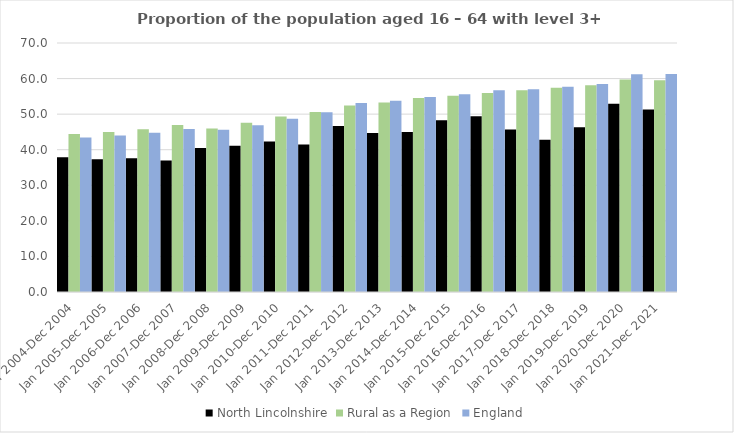
| Category | North Lincolnshire | Rural as a Region | England |
|---|---|---|---|
| Jan 2004-Dec 2004 | 37.9 | 44.405 | 43.4 |
| Jan 2005-Dec 2005 | 37.3 | 44.973 | 44 |
| Jan 2006-Dec 2006 | 37.6 | 45.774 | 44.8 |
| Jan 2007-Dec 2007 | 37 | 46.968 | 45.8 |
| Jan 2008-Dec 2008 | 40.5 | 45.964 | 45.6 |
| Jan 2009-Dec 2009 | 41.1 | 47.59 | 46.9 |
| Jan 2010-Dec 2010 | 42.3 | 49.362 | 48.7 |
| Jan 2011-Dec 2011 | 41.5 | 50.602 | 50.5 |
| Jan 2012-Dec 2012 | 46.7 | 52.439 | 53.1 |
| Jan 2013-Dec 2013 | 44.7 | 53.276 | 53.8 |
| Jan 2014-Dec 2014 | 45 | 54.57 | 54.8 |
| Jan 2015-Dec 2015 | 48.3 | 55.16 | 55.6 |
| Jan 2016-Dec 2016 | 49.4 | 55.941 | 56.7 |
| Jan 2017-Dec 2017 | 45.7 | 56.689 | 57 |
| Jan 2018-Dec 2018 | 42.8 | 57.389 | 57.7 |
| Jan 2019-Dec 2019 | 46.3 | 58.147 | 58.5 |
| Jan 2020-Dec 2020 | 52.9 | 59.771 | 61.2 |
| Jan 2021-Dec 2021 | 51.3 | 59.54 | 61.3 |